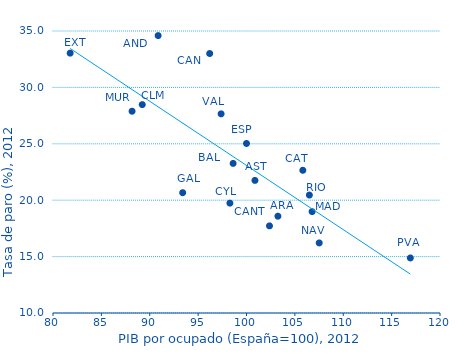
| Category | Series 0 |
|---|---|
| 90.86529391128713 | 34.592 |
| 103.2458168083188 | 18.58 |
| 100.8746462210076 | 21.755 |
| 98.61769215513672 | 23.262 |
| 96.19547165239194 | 33.002 |
| 102.3756964114141 | 17.725 |
| 98.28272249263449 | 19.74 |
| 89.2256782574198 | 28.475 |
| 105.8235042308151 | 22.652 |
| 81.77129169583125 | 33.038 |
| 93.4022105090484 | 20.665 |
| 106.7800274630424 | 18.988 |
| 88.17417458466947 | 27.888 |
| 107.5157427655192 | 16.212 |
| 116.9339960225259 | 14.88 |
| 106.4972735863284 | 20.458 |
| 97.3743656742817 | 27.655 |
| 100.0 | 25.028 |